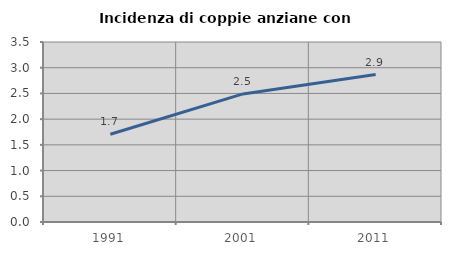
| Category | Incidenza di coppie anziane con figli |
|---|---|
| 1991.0 | 1.706 |
| 2001.0 | 2.491 |
| 2011.0 | 2.867 |